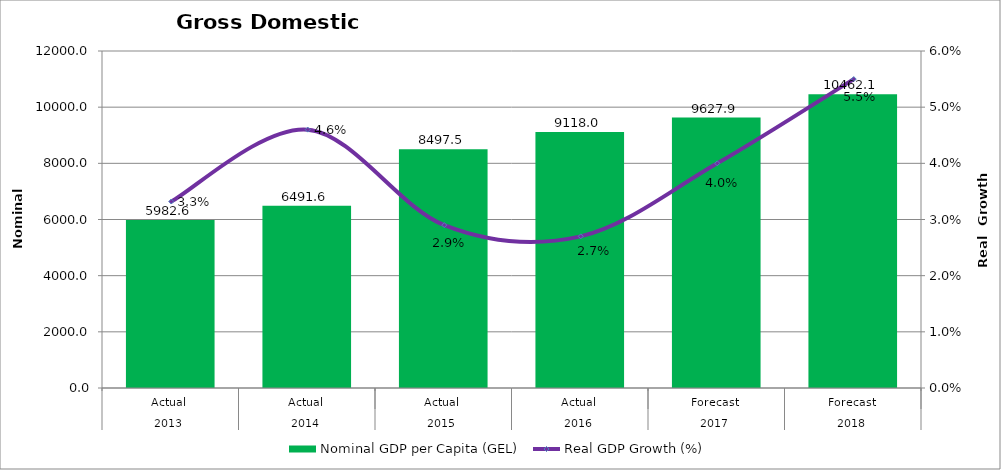
| Category | Nominal GDP per Capita (GEL) |
|---|---|
| 0 | 5982.632 |
| 1 | 6491.589 |
| 2 | 8497.535 |
| 3 | 9118 |
| 4 | 9627.874 |
| 5 | 10462.128 |